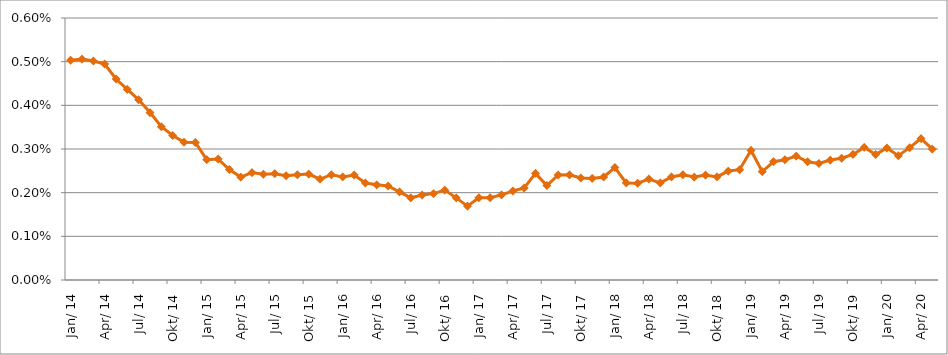
| Category | Durchschnittszins |
|---|---|
| 2014-01-01 | 0.005 |
| 2014-02-01 | 0.005 |
| 2014-03-01 | 0.005 |
| 2014-04-01 | 0.005 |
| 2014-05-01 | 0.005 |
| 2014-06-01 | 0.004 |
| 2014-07-01 | 0.004 |
| 2014-08-01 | 0.004 |
| 2014-09-01 | 0.004 |
| 2014-10-01 | 0.003 |
| 2014-11-01 | 0.003 |
| 2014-12-01 | 0.003 |
| 2015-01-01 | 0.003 |
| 2015-02-01 | 0.003 |
| 2015-03-01 | 0.003 |
| 2015-04-01 | 0.002 |
| 2015-05-01 | 0.002 |
| 2015-06-01 | 0.002 |
| 2015-07-01 | 0.002 |
| 2015-08-01 | 0.002 |
| 2015-09-01 | 0.002 |
| 2015-10-01 | 0.002 |
| 2015-11-01 | 0.002 |
| 2015-12-01 | 0.002 |
| 2016-01-01 | 0.002 |
| 2016-02-01 | 0.002 |
| 2016-03-01 | 0.002 |
| 2016-04-01 | 0.002 |
| 2016-05-01 | 0.002 |
| 2016-06-01 | 0.002 |
| 2016-07-01 | 0.002 |
| 2016-08-01 | 0.002 |
| 2016-09-01 | 0.002 |
| 2016-10-01 | 0.002 |
| 2016-11-01 | 0.002 |
| 2016-12-01 | 0.002 |
| 2017-01-01 | 0.002 |
| 2017-02-01 | 0.002 |
| 2017-03-01 | 0.002 |
| 2017-04-01 | 0.002 |
| 2017-05-01 | 0.002 |
| 2017-06-01 | 0.002 |
| 2017-07-01 | 0.002 |
| 2017-08-01 | 0.002 |
| 2017-09-01 | 0.002 |
| 2017-10-01 | 0.002 |
| 2017-11-01 | 0.002 |
| 2017-12-01 | 0.002 |
| 2018-01-01 | 0.003 |
| 2018-02-01 | 0.002 |
| 2018-03-01 | 0.002 |
| 2018-04-01 | 0.002 |
| 2018-05-01 | 0.002 |
| 2018-06-01 | 0.002 |
| 2018-07-01 | 0.002 |
| 2018-08-01 | 0.002 |
| 2018-09-01 | 0.002 |
| 2018-10-01 | 0.002 |
| 2018-11-01 | 0.002 |
| 2018-12-01 | 0.003 |
| 2019-01-01 | 0.003 |
| 2019-02-01 | 0.002 |
| 2019-03-01 | 0.003 |
| 2019-04-01 | 0.003 |
| 2019-05-01 | 0.003 |
| 2019-06-01 | 0.003 |
| 2019-07-01 | 0.003 |
| 2019-08-01 | 0.003 |
| 2019-09-01 | 0.003 |
| 2019-10-01 | 0.003 |
| 2019-11-01 | 0.003 |
| 2019-12-01 | 0.003 |
| 2020-01-01 | 0.003 |
| 2020-02-01 | 0.003 |
| 2020-03-01 | 0.003 |
| 2020-04-01 | 0.003 |
| 2020-05-01 | 0.003 |